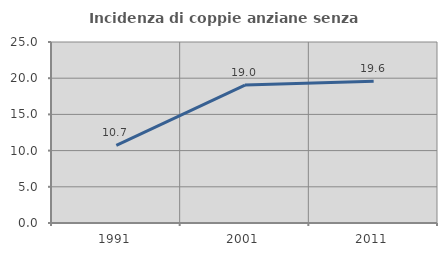
| Category | Incidenza di coppie anziane senza figli  |
|---|---|
| 1991.0 | 10.714 |
| 2001.0 | 19.048 |
| 2011.0 | 19.565 |